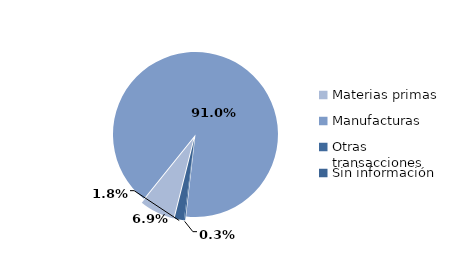
| Category | Series 0 |
|---|---|
| Materias primas | 2497.922 |
| Manufacturas | 33027.683 |
| Otras transacciones | 90.863 |
| Sin información | 661.223 |